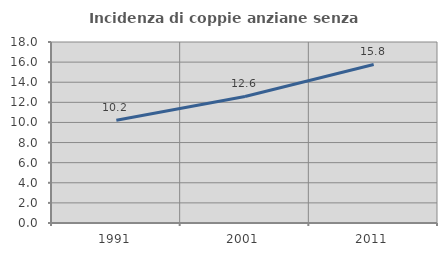
| Category | Incidenza di coppie anziane senza figli  |
|---|---|
| 1991.0 | 10.22 |
| 2001.0 | 12.584 |
| 2011.0 | 15.766 |